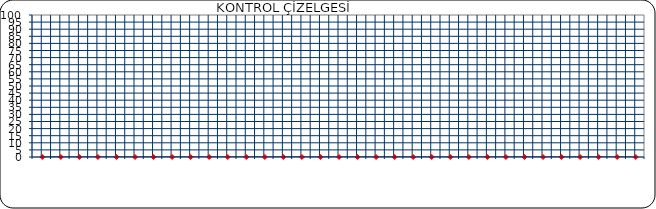
| Category | Series 0 |
|---|---|
|  | 0 |
|  | 0 |
|  | 0 |
|  | 0 |
|  | 0 |
|  | 0 |
|  | 0 |
|  | 0 |
|  | 0 |
|  | 0 |
|  | 0 |
|  | 0 |
|  | 0 |
|  | 0 |
|  | 0 |
|  | 0 |
|  | 0 |
|  | 0 |
|  | 0 |
|  | 0 |
|  | 0 |
|  | 0 |
|  | 0 |
|  | 0 |
|  | 0 |
|  | 0 |
|  | 0 |
|  | 0 |
|  | 0 |
|  | 0 |
|  | 0 |
|  | 0 |
|  | 0 |